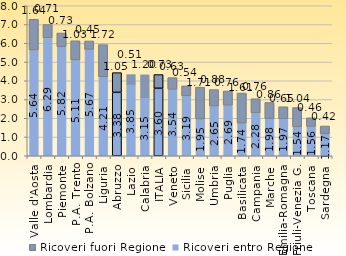
| Category | Ricoveri entro Regione | Ricoveri fuori Regione |
|---|---|---|
| Valle d'Aosta | 5.638 | 1.639 |
| Lombardia | 6.287 | 0.712 |
| Piemonte | 5.816 | 0.732 |
| P.A. Trento | 5.107 | 1.027 |
| P.A. Bolzano | 5.67 | 0.452 |
| Liguria | 4.211 | 1.718 |
| Abruzzo | 3.382 | 1.051 |
| Lazio | 3.852 | 0.505 |
| Calabria | 3.148 | 1.197 |
| ITALIA | 3.6 | 0.731 |
| Veneto | 3.539 | 0.63 |
| Sicilia | 3.19 | 0.537 |
| Molise | 1.951 | 1.71 |
| Umbria | 2.649 | 0.881 |
| Puglia | 2.694 | 0.759 |
| Basilicata | 1.736 | 1.611 |
| Campania | 2.281 | 0.761 |
| Marche | 1.982 | 0.86 |
| Emilia-Romagna | 1.967 | 0.646 |
| Friuli-Venezia G. | 1.536 | 1.036 |
| Toscana | 1.563 | 0.46 |
| Sardegna | 1.17 | 0.418 |